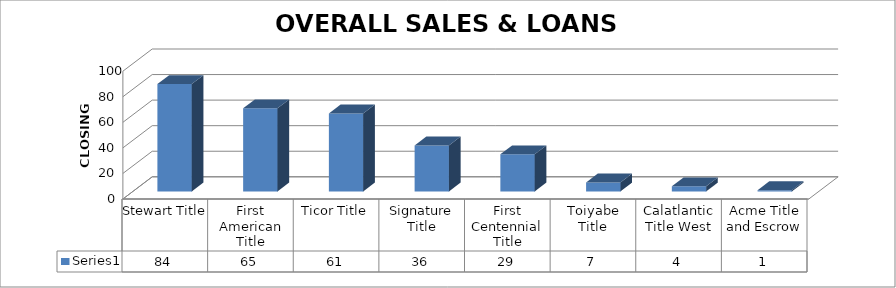
| Category | Series 0 |
|---|---|
| Stewart Title | 84 |
| First American Title | 65 |
| Ticor Title | 61 |
| Signature Title | 36 |
| First Centennial Title | 29 |
| Toiyabe Title | 7 |
| Calatlantic Title West | 4 |
| Acme Title and Escrow | 1 |